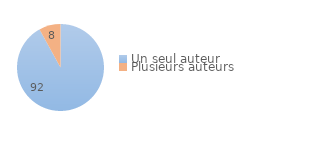
| Category | Series 0 |
|---|---|
| Un seul auteur | 92 |
| Plusieurs auteurs | 8 |
| Ne sait pas/Refus | 0 |